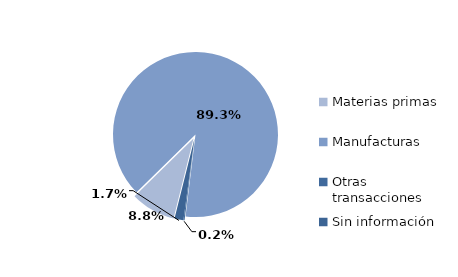
| Category | Series 0 |
|---|---|
| Materias primas | 1864.038 |
| Manufacturas | 18953.972 |
| Otras transacciones | 47.151 |
| Sin información | 369.757 |